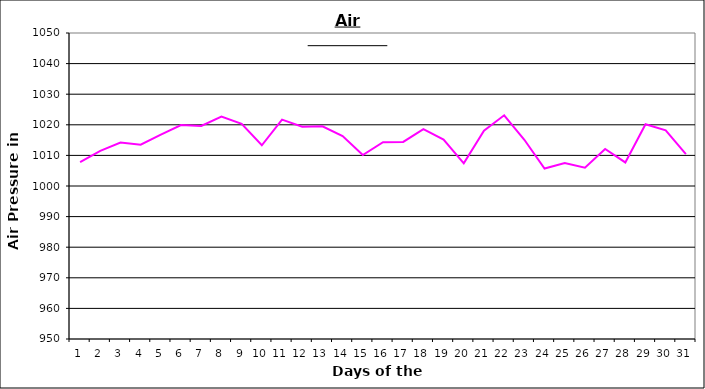
| Category | Series 0 |
|---|---|
| 0 | 1007.8 |
| 1 | 1011.5 |
| 2 | 1014.2 |
| 3 | 1013.5 |
| 4 | 1016.8 |
| 5 | 1019.9 |
| 6 | 1019.6 |
| 7 | 1022.7 |
| 8 | 1020.3 |
| 9 | 1013.3 |
| 10 | 1021.7 |
| 11 | 1019.4 |
| 12 | 1019.5 |
| 13 | 1016.3 |
| 14 | 1010.1 |
| 15 | 1014.3 |
| 16 | 1014.4 |
| 17 | 1018.6 |
| 18 | 1015.2 |
| 19 | 1007.4 |
| 20 | 1018.1 |
| 21 | 1023.1 |
| 22 | 1015.1 |
| 23 | 1005.7 |
| 24 | 1007.5 |
| 25 | 1006 |
| 26 | 1012.1 |
| 27 | 1007.7 |
| 28 | 1020.2 |
| 29 | 1018.2 |
| 30 | 1010.4 |